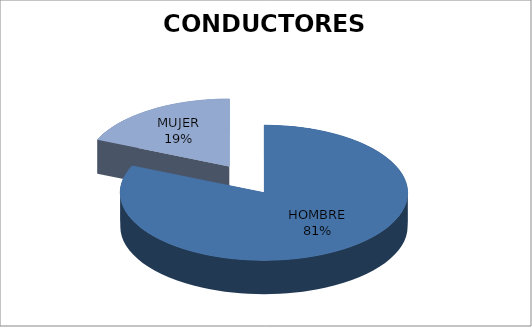
| Category | E.E. |
|---|---|
| HOMBRE | 22 |
| MUJER | 5 |